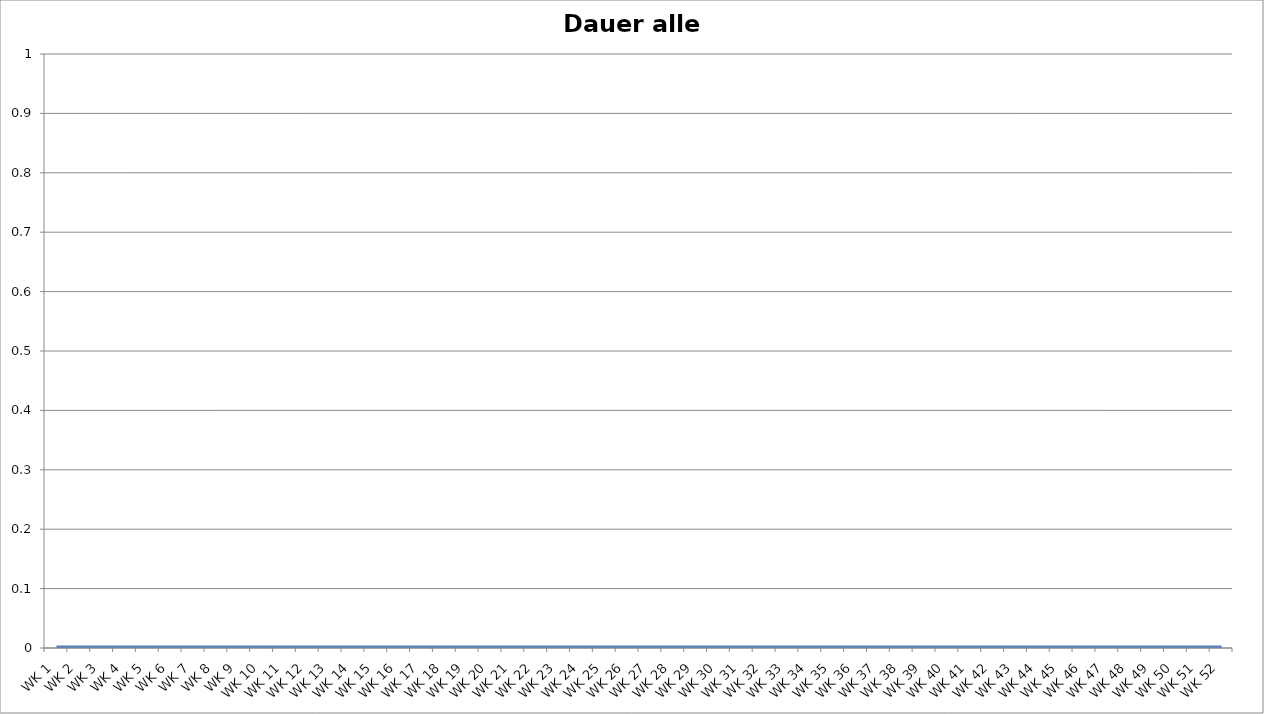
| Category | Dauer |
|---|---|
| WK 1 | 0 |
| WK 2 | 0 |
| WK 3 | 0 |
| WK 4 | 0 |
| WK 5 | 0 |
| WK 6 | 0 |
| WK 7 | 0 |
| WK 8 | 0 |
| WK 9 | 0 |
| WK 10 | 0 |
| WK 11 | 0 |
| WK 12 | 0 |
| WK 13 | 0 |
| WK 14 | 0 |
| WK 15 | 0 |
| WK 16 | 0 |
| WK 17 | 0 |
| WK 18 | 0 |
| WK 19 | 0 |
| WK 20 | 0 |
| WK 21 | 0 |
| WK 22 | 0 |
| WK 23 | 0 |
| WK 24 | 0 |
| WK 25 | 0 |
| WK 26 | 0 |
| WK 27 | 0 |
| WK 28 | 0 |
| WK 29 | 0 |
| WK 30 | 0 |
| WK 31 | 0 |
| WK 32 | 0 |
| WK 33 | 0 |
| WK 34 | 0 |
| WK 35 | 0 |
| WK 36 | 0 |
| WK 37 | 0 |
| WK 38 | 0 |
| WK 39 | 0 |
| WK 40 | 0 |
| WK 41 | 0 |
| WK 42 | 0 |
| WK 43 | 0 |
| WK 44 | 0 |
| WK 45 | 0 |
| WK 46 | 0 |
| WK 47 | 0 |
| WK 48 | 0 |
| WK 49 | 0 |
| WK 50 | 0 |
| WK 51 | 0 |
| WK 52 | 0 |